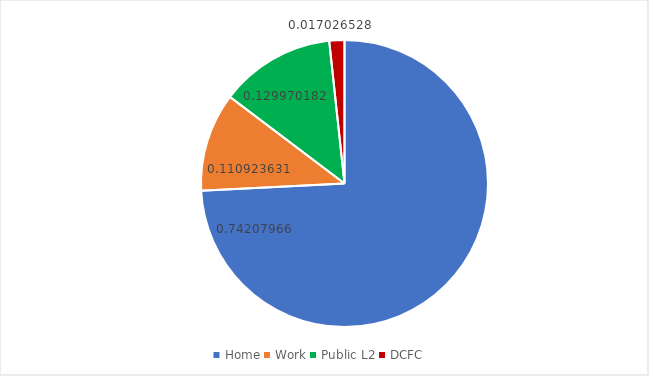
| Category | Series 0 |
|---|---|
| Home | 0.742 |
| Work | 0.111 |
| Public L2 | 0.13 |
| DCFC | 0.017 |